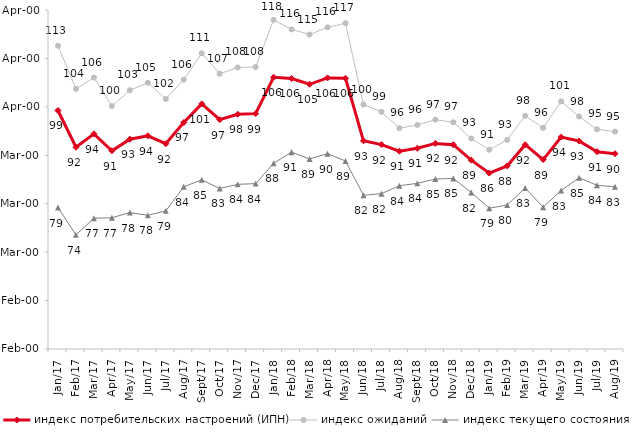
| Category | индекс потребительских настроений (ИПН) | Series 0 | индекс ожиданий | Series 3 | индекс текущего состояния |
|---|---|---|---|---|---|
| 2017-01-01 | 99.25 | 2017-01-01 | 112.617 | 2017-01-01 | 79.2 |
| 2017-02-01 | 91.66 | 2017-02-01 | 103.717 | 2017-02-01 | 73.575 |
| 2017-03-01 | 94.43 | 2017-03-01 | 106.05 | 2017-03-01 | 77 |
| 2017-04-01 | 90.94 | 2017-04-01 | 100.167 | 2017-04-01 | 77.1 |
| 2017-05-01 | 93.33 | 2017-05-01 | 103.433 | 2017-05-01 | 78.175 |
| 2017-06-01 | 94.02 | 2017-06-01 | 104.967 | 2017-06-01 | 77.6 |
| 2017-07-01 | 92.39 | 2017-07-01 | 101.633 | 2017-07-01 | 78.525 |
| 2017-08-01 | 96.77 | 2017-08-01 | 105.617 | 2017-08-01 | 83.5 |
| 2017-09-01 | 100.61 | 2017-09-01 | 111.067 | 2017-09-01 | 84.925 |
| 2017-10-01 | 97.36 | 2017-10-01 | 106.833 | 2017-10-01 | 83.15 |
| 2017-11-01 | 98.48 | 2017-11-01 | 108.133 | 2017-11-01 | 84 |
| 2017-12-01 | 98.6 | 2017-12-01 | 108.233 | 2017-12-01 | 84.15 |
| 2018-01-01 | 106.11 | 2018-01-01 | 117.95 | 2018-01-01 | 88.35 |
| 2018-02-01 | 105.86 | 2018-02-01 | 116 | 2018-02-01 | 90.65 |
| 2018-03-01 | 104.66 | 2018-03-01 | 114.933 | 2018-03-01 | 89.25 |
| 2018-04-01 | 105.98 | 2018-04-01 | 116.417 | 2018-04-01 | 90.325 |
| 2018-05-01 | 105.9 | 2018-05-01 | 117.283 | 2018-05-01 | 88.825 |
| 2018-06-01 | 92.99 | 2018-06-01 | 100.483 | 2018-06-01 | 81.75 |
| 2018-07-01 | 92.21 | 2018-07-01 | 98.967 | 2018-07-01 | 82.075 |
| 2018-08-01 | 90.85 | 2018-08-01 | 95.6 | 2018-08-01 | 83.725 |
| 2018-09-01 | 91.44 | 2018-09-01 | 96.267 | 2018-09-01 | 84.2 |
| 2018-10-01 | 92.45 | 2018-10-01 | 97.35 | 2018-10-01 | 85.1 |
| 2018-11-01 | 92.186 | 2018-11-01 | 96.823 | 2018-11-01 | 85.23 |
| 2018-12-01 | 89 | 2018-12-01 | 93.467 | 2018-12-01 | 82.3 |
| 2019-01-01 | 86.32 | 2019-01-01 | 91.15 | 2019-01-01 | 79.075 |
| 2019-02-01 | 87.8 | 2019-02-01 | 93.183 | 2019-02-01 | 79.725 |
| 2019-03-01 | 92.183 | 2019-03-01 | 98.144 | 2019-03-01 | 83.242 |
| 2019-04-01 | 89.109 | 2019-04-01 | 95.66 | 2019-04-01 | 79.282 |
| 2019-05-01 | 93.759 | 2019-05-01 | 101.123 | 2019-05-01 | 82.714 |
| 2019-06-01 | 92.948 | 2019-06-01 | 98.005 | 2019-06-01 | 85.362 |
| 2019-07-01 | 90.743 | 2019-07-01 | 95.363 | 2019-07-01 | 83.812 |
| 2019-08-01 | 90.33 | 2019-08-01 | 94.888 | 2019-08-01 | 83.492 |